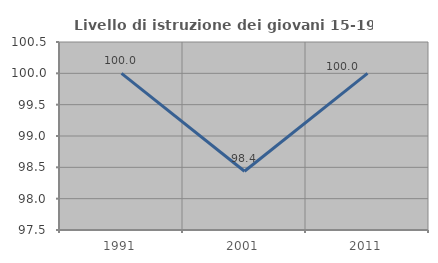
| Category | Livello di istruzione dei giovani 15-19 anni |
|---|---|
| 1991.0 | 100 |
| 2001.0 | 98.438 |
| 2011.0 | 100 |